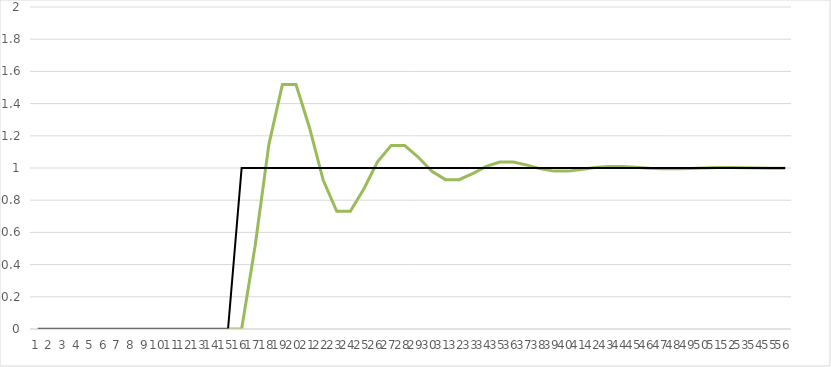
| Category | 3) | Series 5 |
|---|---|---|
| 0 | 0 | 0 |
| 1 | 0 | 0 |
| 2 | 0 | 0 |
| 3 | 0 | 0 |
| 4 | 0 | 0 |
| 5 | 0 | 0 |
| 6 | 0 | 0 |
| 7 | 0 | 0 |
| 8 | 0 | 0 |
| 9 | 0 | 0 |
| 10 | 0 | 0 |
| 11 | 0 | 0 |
| 12 | 0 | 0 |
| 13 | 0 | 0 |
| 14 | 0 | 0 |
| 15 | 0 | 1 |
| 16 | 0.52 | 1 |
| 17 | 1.144 | 1 |
| 18 | 1.518 | 1 |
| 19 | 1.518 | 1 |
| 20 | 1.249 | 1 |
| 21 | 0.925 | 1 |
| 22 | 0.731 | 1 |
| 23 | 0.731 | 1 |
| 24 | 0.871 | 1 |
| 25 | 1.039 | 1 |
| 26 | 1.139 | 1 |
| 27 | 1.139 | 1 |
| 28 | 1.067 | 1 |
| 29 | 0.98 | 1 |
| 30 | 0.928 | 1 |
| 31 | 0.928 | 1 |
| 32 | 0.965 | 1 |
| 33 | 1.01 | 1 |
| 34 | 1.037 | 1 |
| 35 | 1.037 | 1 |
| 36 | 1.018 | 1 |
| 37 | 0.995 | 1 |
| 38 | 0.981 | 1 |
| 39 | 0.981 | 1 |
| 40 | 0.991 | 1 |
| 41 | 1.003 | 1 |
| 42 | 1.01 | 1 |
| 43 | 1.01 | 1 |
| 44 | 1.005 | 1 |
| 45 | 0.999 | 1 |
| 46 | 0.995 | 1 |
| 47 | 0.995 | 1 |
| 48 | 0.997 | 1 |
| 49 | 1.001 | 1 |
| 50 | 1.003 | 1 |
| 51 | 1.003 | 1 |
| 52 | 1.001 | 1 |
| 53 | 1 | 1 |
| 54 | 0.999 | 1 |
| 55 | 0.999 | 1 |